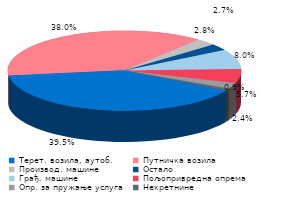
| Category | Series 0 |
|---|---|
| Терет. возила, аутоб. | 0.395 |
| Путничка возила | 0.38 |
| Производ. машине | 0.028 |
| Остало | 0.027 |
| Грађ. машине | 0.08 |
| Пољопривредна опрема | 0.057 |
| Опр. за пружање услуга | 0.024 |
| Некретнине | 0.009 |